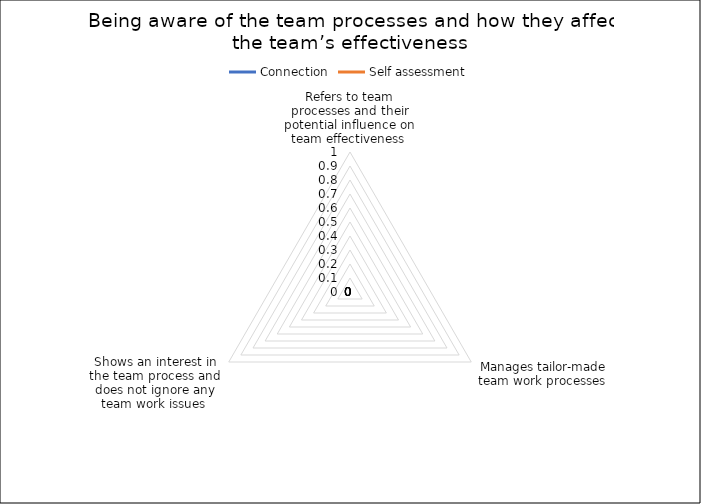
| Category | Connection | Self assessment |
|---|---|---|
| Refers to team processes and their potential influence on team effectiveness  | 0 | 0 |
| Manages tailor-made team work processes  | 0 | 0 |
| Shows an interest in the team process and does not ignore any team work issues  | 0 | 0 |